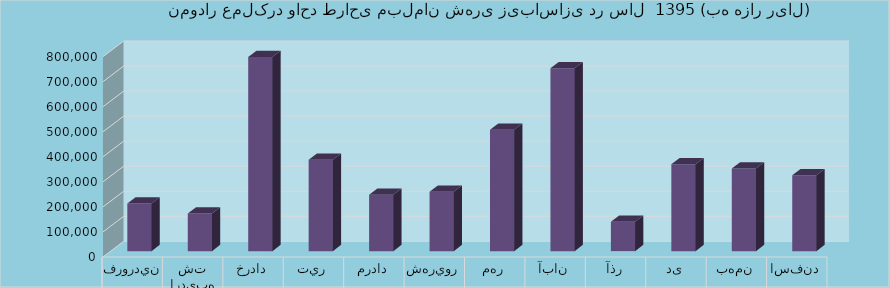
| Category | برآورد |
|---|---|
| فروردين | 190000 |
| ارديبهشت | 150000 |
| خرداد | 775000 |
| تير | 365000 |
| مرداد | 225000 |
| شهريور | 237500 |
| مهر | 485000 |
| آبان | 730000 |
| آذر | 117000 |
| دی | 347000 |
| بهمن | 330000 |
| اسفند | 302500 |